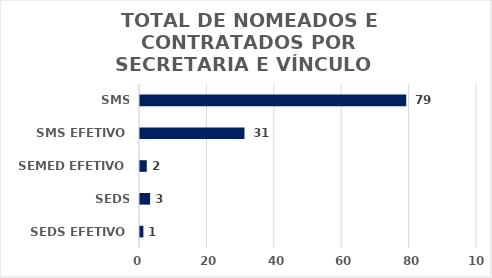
| Category | Series 0 |
|---|---|
| SEDS EFETIVO | 1 |
| SEDS TEMPORÁRIO | 3 |
| SEMED EFETIVO | 2 |
| SMS EFETIVO | 31 |
| SMS TEMPORÁRIO | 79 |